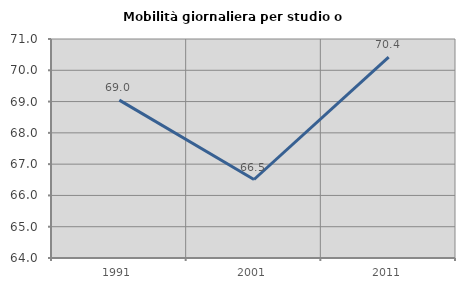
| Category | Mobilità giornaliera per studio o lavoro |
|---|---|
| 1991.0 | 69.045 |
| 2001.0 | 66.509 |
| 2011.0 | 70.423 |